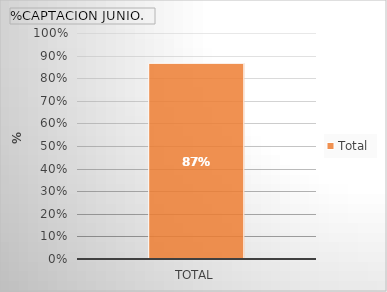
| Category | Total |
|---|---|
| Total | 0.866 |